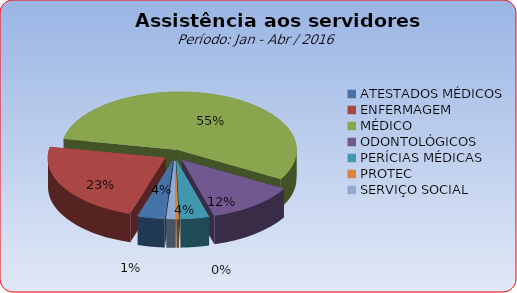
| Category | Series 0 |
|---|---|
| ATESTADOS MÉDICOS | 3.733 |
| ENFERMAGEM | 23.154 |
| MÉDICO | 55.327 |
| ODONTOLÓGICOS | 12.248 |
| PERÍCIAS MÉDICAS | 3.943 |
| PROTEC | 0.336 |
| SERVIÇO SOCIAL | 1.258 |